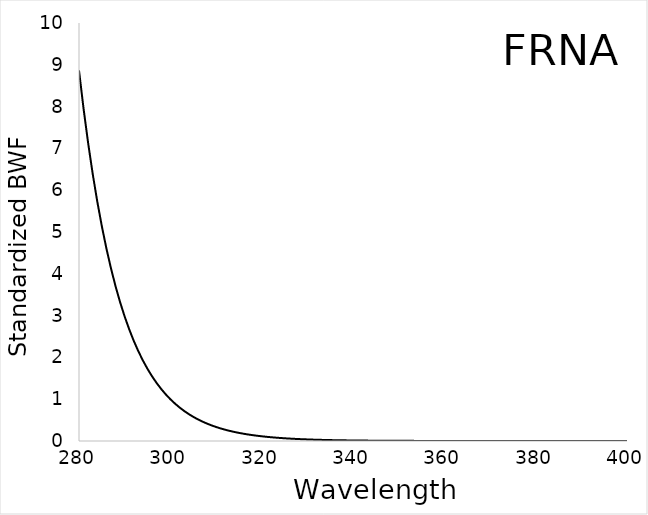
| Category | BWF |
|---|---|
| 280.0 | 8.866 |
| 281.0 | 7.949 |
| 282.0 | 7.128 |
| 283.0 | 6.391 |
| 284.0 | 5.73 |
| 285.0 | 5.138 |
| 286.0 | 4.607 |
| 287.0 | 4.131 |
| 288.0 | 3.704 |
| 289.0 | 3.321 |
| 290.0 | 2.978 |
| 291.0 | 2.67 |
| 292.0 | 2.394 |
| 293.0 | 2.146 |
| 294.0 | 1.924 |
| 295.0 | 1.726 |
| 296.0 | 1.547 |
| 297.0 | 1.387 |
| 298.0 | 1.244 |
| 299.0 | 1.115 |
| 300.0 | 1 |
| 301.0 | 0.897 |
| 302.0 | 0.804 |
| 303.0 | 0.721 |
| 304.0 | 0.646 |
| 305.0 | 0.58 |
| 306.0 | 0.52 |
| 307.0 | 0.466 |
| 308.0 | 0.418 |
| 309.0 | 0.375 |
| 310.0 | 0.336 |
| 311.0 | 0.301 |
| 312.0 | 0.27 |
| 313.0 | 0.242 |
| 314.0 | 0.217 |
| 315.0 | 0.195 |
| 316.0 | 0.175 |
| 317.0 | 0.156 |
| 318.0 | 0.14 |
| 319.0 | 0.126 |
| 320.0 | 0.113 |
| 321.0 | 0.101 |
| 322.0 | 0.091 |
| 323.0 | 0.081 |
| 324.0 | 0.073 |
| 325.0 | 0.065 |
| 326.0 | 0.059 |
| 327.0 | 0.053 |
| 328.0 | 0.047 |
| 329.0 | 0.042 |
| 330.0 | 0.038 |
| 331.0 | 0.034 |
| 332.0 | 0.03 |
| 333.0 | 0.027 |
| 334.0 | 0.024 |
| 335.0 | 0.022 |
| 336.0 | 0.02 |
| 337.0 | 0.018 |
| 338.0 | 0.016 |
| 339.0 | 0.014 |
| 340.0 | 0.013 |
| 341.0 | 0.011 |
| 342.0 | 0.01 |
| 343.0 | 0.009 |
| 344.0 | 0.008 |
| 345.0 | 0.007 |
| 346.0 | 0.007 |
| 347.0 | 0.006 |
| 348.0 | 0.005 |
| 349.0 | 0.005 |
| 350.0 | 0.004 |
| 351.0 | 0.004 |
| 352.0 | 0.003 |
| 353.0 | 0.003 |
| 354.0 | 0.003 |
| 355.0 | 0.002 |
| 356.0 | 0.002 |
| 357.0 | 0.002 |
| 358.0 | 0.002 |
| 359.0 | 0.002 |
| 360.0 | 0.001 |
| 361.0 | 0.001 |
| 362.0 | 0.001 |
| 363.0 | 0.001 |
| 364.0 | 0.001 |
| 365.0 | 0.001 |
| 366.0 | 0.001 |
| 367.0 | 0.001 |
| 368.0 | 0.001 |
| 369.0 | 0.001 |
| 370.0 | 0 |
| 371.0 | 0 |
| 372.0 | 0 |
| 373.0 | 0 |
| 374.0 | 0 |
| 375.0 | 0 |
| 376.0 | 0 |
| 377.0 | 0 |
| 378.0 | 0 |
| 379.0 | 0 |
| 380.0 | 0 |
| 381.0 | 0 |
| 382.0 | 0 |
| 383.0 | 0 |
| 384.0 | 0 |
| 385.0 | 0 |
| 386.0 | 0 |
| 387.0 | 0 |
| 388.0 | 0 |
| 389.0 | 0 |
| 390.0 | 0 |
| 391.0 | 0 |
| 392.0 | 0 |
| 393.0 | 0 |
| 394.0 | 0 |
| 395.0 | 0 |
| 396.0 | 0 |
| 397.0 | 0 |
| 398.0 | 0 |
| 399.0 | 0 |
| 400.0 | 0 |
| 401.0 | 0 |
| 402.0 | 0 |
| 403.0 | 0 |
| 404.0 | 0 |
| 405.0 | 0 |
| 406.0 | 0 |
| 407.0 | 0 |
| 408.0 | 0 |
| 409.0 | 0 |
| 410.0 | 0 |
| 411.0 | 0 |
| 412.0 | 0 |
| 413.0 | 0 |
| 414.0 | 0 |
| 415.0 | 0 |
| 416.0 | 0 |
| 417.0 | 0 |
| 418.0 | 0 |
| 419.0 | 0 |
| 420.0 | 0 |
| 421.0 | 0 |
| 422.0 | 0 |
| 423.0 | 0 |
| 424.0 | 0 |
| 425.0 | 0 |
| 426.0 | 0 |
| 427.0 | 0 |
| 428.0 | 0 |
| 429.0 | 0 |
| 430.0 | 0 |
| 431.0 | 0 |
| 432.0 | 0 |
| 433.0 | 0 |
| 434.0 | 0 |
| 435.0 | 0 |
| 436.0 | 0 |
| 437.0 | 0 |
| 438.0 | 0 |
| 439.0 | 0 |
| 440.0 | 0 |
| 441.0 | 0 |
| 442.0 | 0 |
| 443.0 | 0 |
| 444.0 | 0 |
| 445.0 | 0 |
| 446.0 | 0 |
| 447.0 | 0 |
| 448.0 | 0 |
| 449.0 | 0 |
| 450.0 | 0 |
| 451.0 | 0 |
| 452.0 | 0 |
| 453.0 | 0 |
| 454.0 | 0 |
| 455.0 | 0 |
| 456.0 | 0 |
| 457.0 | 0 |
| 458.0 | 0 |
| 459.0 | 0 |
| 460.0 | 0 |
| 461.0 | 0 |
| 462.0 | 0 |
| 463.0 | 0 |
| 464.0 | 0 |
| 465.0 | 0 |
| 466.0 | 0 |
| 467.0 | 0 |
| 468.0 | 0 |
| 469.0 | 0 |
| 470.0 | 0 |
| 471.0 | 0 |
| 472.0 | 0 |
| 473.0 | 0 |
| 474.0 | 0 |
| 475.0 | 0 |
| 476.0 | 0 |
| 477.0 | 0 |
| 478.0 | 0 |
| 479.0 | 0 |
| 480.0 | 0 |
| 481.0 | 0 |
| 482.0 | 0 |
| 483.0 | 0 |
| 484.0 | 0 |
| 485.0 | 0 |
| 486.0 | 0 |
| 487.0 | 0 |
| 488.0 | 0 |
| 489.0 | 0 |
| 490.0 | 0 |
| 491.0 | 0 |
| 492.0 | 0 |
| 493.0 | 0 |
| 494.0 | 0 |
| 495.0 | 0 |
| 496.0 | 0 |
| 497.0 | 0 |
| 498.0 | 0 |
| 499.0 | 0 |
| 500.0 | 0 |